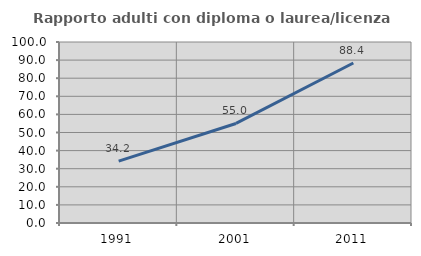
| Category | Rapporto adulti con diploma o laurea/licenza media  |
|---|---|
| 1991.0 | 34.211 |
| 2001.0 | 55 |
| 2011.0 | 88.406 |